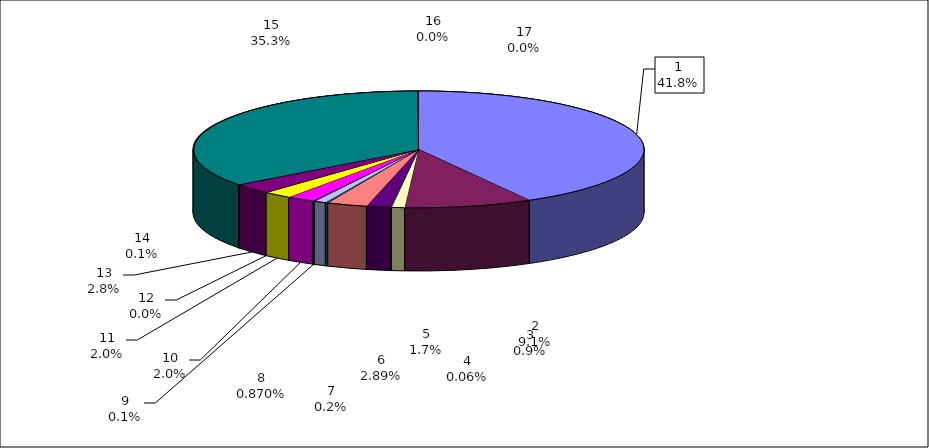
| Category | Series 0 |
|---|---|
| 0 | 41.83 |
| 1 | 9.149 |
| 2 | 0.932 |
| 3 | 0.058 |
| 4 | 1.738 |
| 5 | 2.886 |
| 6 | 0.182 |
| 7 | 0.87 |
| 8 | 0.111 |
| 9 | 2.015 |
| 10 | 2.033 |
| 11 | 0.011 |
| 12 | 2.819 |
| 13 | 0.069 |
| 14 | 35.25 |
| 15 | 0.048 |
| 16 | 0 |